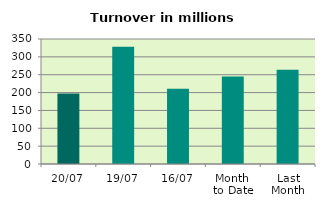
| Category | Series 0 |
|---|---|
| 20/07 | 197.19 |
| 19/07 | 328.608 |
| 16/07 | 210.913 |
| Month 
to Date | 244.781 |
| Last
Month | 264.074 |